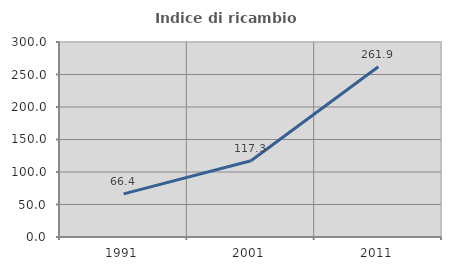
| Category | Indice di ricambio occupazionale  |
|---|---|
| 1991.0 | 66.368 |
| 2001.0 | 117.308 |
| 2011.0 | 261.932 |